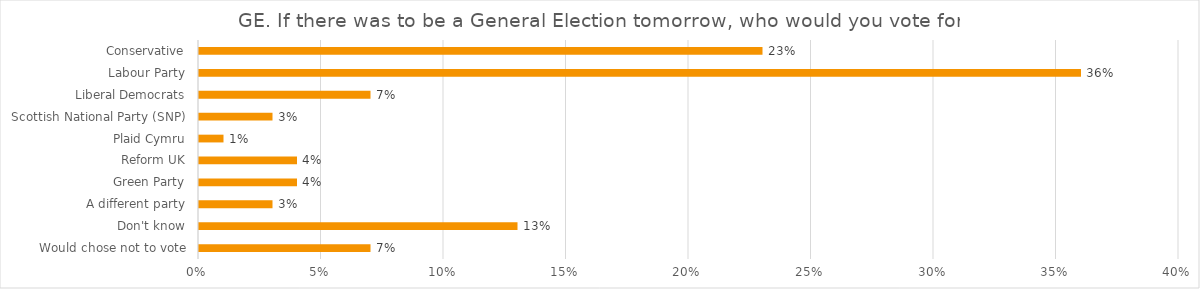
| Category | GE. If there was to be a General Election tomorrow, who would you vote for? |
|---|---|
| Would chose not to vote | 0.07 |
| Don't know | 0.13 |
| A different party | 0.03 |
| Green Party | 0.04 |
| Reform UK | 0.04 |
| Plaid Cymru | 0.01 |
| Scottish National Party (SNP) | 0.03 |
| Liberal Democrats | 0.07 |
| Labour Party | 0.36 |
| Conservative | 0.23 |